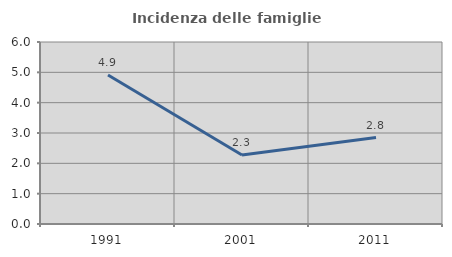
| Category | Incidenza delle famiglie numerose |
|---|---|
| 1991.0 | 4.912 |
| 2001.0 | 2.273 |
| 2011.0 | 2.85 |